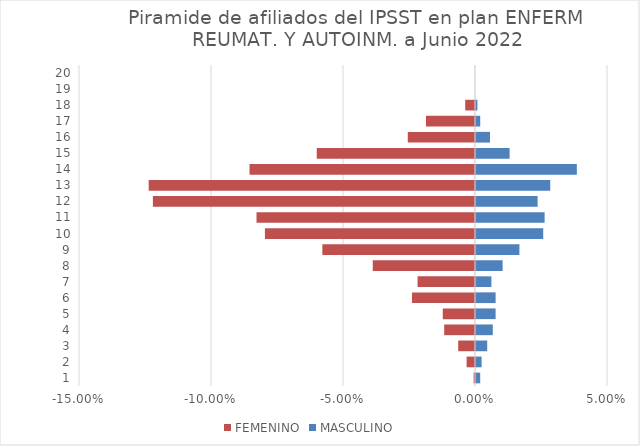
| Category | FEMENINO | MASCULINO |
|---|---|---|
| 0 | -0.001 | 0.002 |
| 1 | -0.003 | 0.002 |
| 2 | -0.006 | 0.004 |
| 3 | -0.012 | 0.006 |
| 4 | -0.012 | 0.007 |
| 5 | -0.024 | 0.007 |
| 6 | -0.022 | 0.006 |
| 7 | -0.039 | 0.01 |
| 8 | -0.058 | 0.016 |
| 9 | -0.08 | 0.025 |
| 10 | -0.083 | 0.026 |
| 11 | -0.122 | 0.023 |
| 12 | -0.124 | 0.028 |
| 13 | -0.085 | 0.038 |
| 14 | -0.06 | 0.013 |
| 15 | -0.025 | 0.005 |
| 16 | -0.019 | 0.002 |
| 17 | -0.004 | 0.001 |
| 18 | 0 | 0 |
| 19 | 0 | 0 |